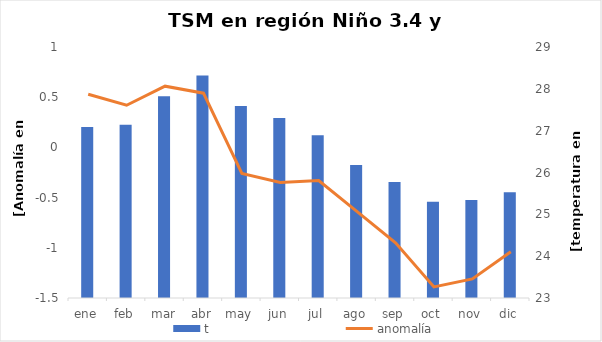
| Category | t |
|---|---|
| ene | 27.09 |
| feb | 27.14 |
| mar | 27.82 |
| abr | 28.32 |
| may | 27.59 |
| jun | 27.3 |
| jul | 26.89 |
| ago | 26.18 |
| sep | 25.77 |
| oct | 25.3 |
| nov | 25.34 |
| dic | 25.53 |